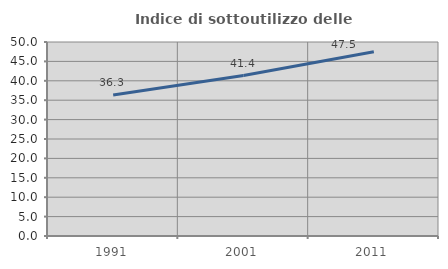
| Category | Indice di sottoutilizzo delle abitazioni  |
|---|---|
| 1991.0 | 36.321 |
| 2001.0 | 41.355 |
| 2011.0 | 47.482 |